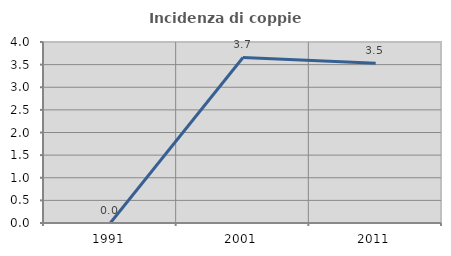
| Category | Incidenza di coppie miste |
|---|---|
| 1991.0 | 0 |
| 2001.0 | 3.659 |
| 2011.0 | 3.529 |